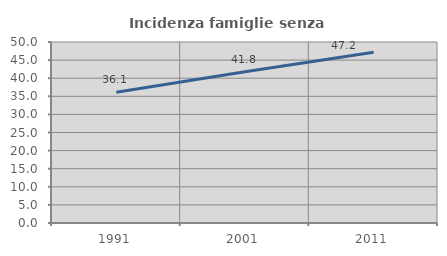
| Category | Incidenza famiglie senza nuclei |
|---|---|
| 1991.0 | 36.134 |
| 2001.0 | 41.808 |
| 2011.0 | 47.154 |